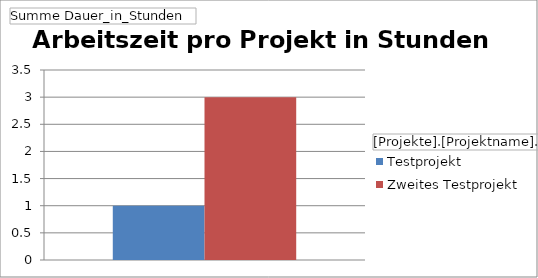
| Category | Testprojekt | Zweites Testprojekt |
|---|---|---|
| Total | 1 | 3 |